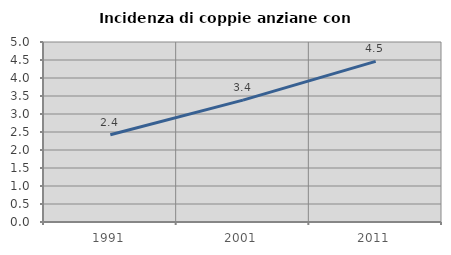
| Category | Incidenza di coppie anziane con figli |
|---|---|
| 1991.0 | 2.422 |
| 2001.0 | 3.386 |
| 2011.0 | 4.461 |